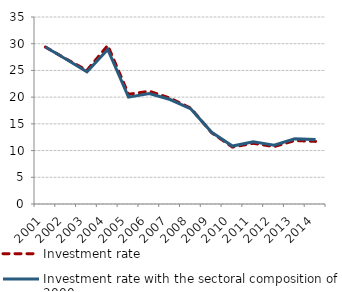
| Category | Investment rate | Investment rate with the sectoral composition of 2000 |
|---|---|---|
| 2001.0 | 29.378 | 29.378 |
| 2002.0 | 27.144 | 27.096 |
| 2003.0 | 25.015 | 24.73 |
| 2004.0 | 29.668 | 28.914 |
| 2005.0 | 20.534 | 20.007 |
| 2006.0 | 21.106 | 20.68 |
| 2007.0 | 19.814 | 19.557 |
| 2008.0 | 17.916 | 17.791 |
| 2009.0 | 13.327 | 13.426 |
| 2010.0 | 10.656 | 10.847 |
| 2011.0 | 11.363 | 11.639 |
| 2012.0 | 10.741 | 10.999 |
| 2013.0 | 11.879 | 12.189 |
| 2014.0 | 11.717 | 12.079 |